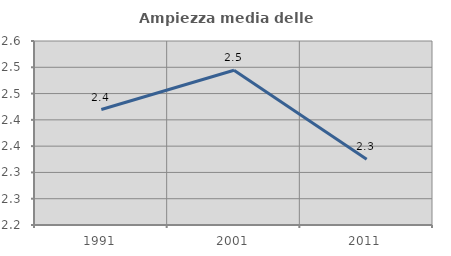
| Category | Ampiezza media delle famiglie |
|---|---|
| 1991.0 | 2.42 |
| 2001.0 | 2.494 |
| 2011.0 | 2.325 |